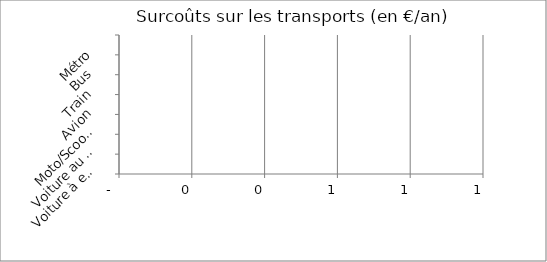
| Category | surcoûts en € |
|---|---|
| Voiture à essence | 0 |
| Voiture au gaz | 0 |
| Moto/Scooter/Mobilette | 0 |
| Avion | 0 |
| Train | 0 |
| Bus | 0 |
| Métro | 0 |